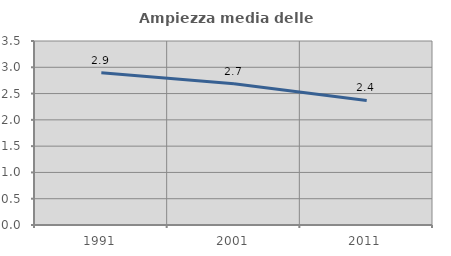
| Category | Ampiezza media delle famiglie |
|---|---|
| 1991.0 | 2.895 |
| 2001.0 | 2.685 |
| 2011.0 | 2.37 |